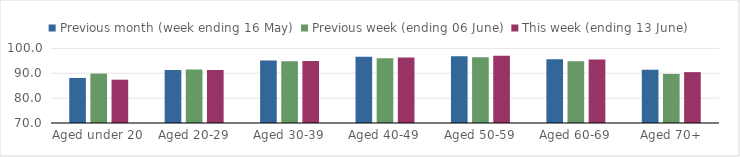
| Category | Previous month (week ending 16 May) | Previous week (ending 06 June) | This week (ending 13 June) |
|---|---|---|---|
| Aged under 20 | 88.125 | 89.874 | 87.427 |
| Aged 20-29 | 91.286 | 91.507 | 91.289 |
| Aged 30-39 | 95.141 | 94.817 | 94.922 |
| Aged 40-49 | 96.61 | 96.071 | 96.369 |
| Aged 50-59 | 96.857 | 96.42 | 97.034 |
| Aged 60-69 | 95.608 | 94.8 | 95.58 |
| Aged 70+ | 91.416 | 89.737 | 90.467 |